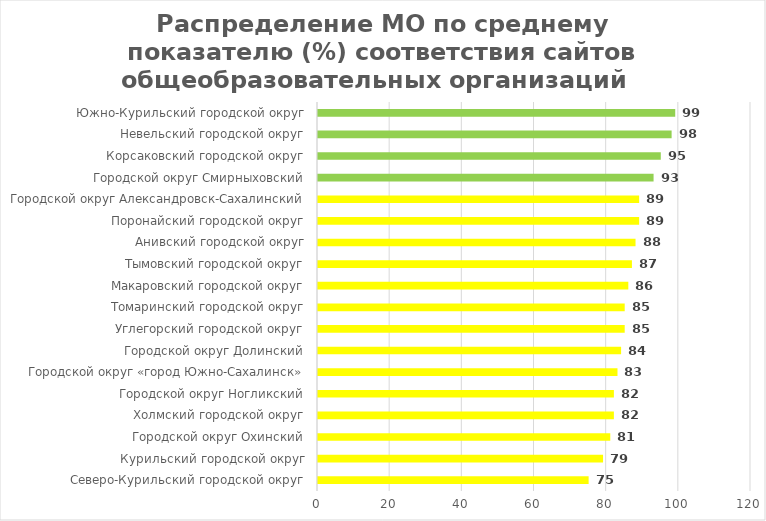
| Category | Series 0 |
|---|---|
| Северо-Курильский городской округ | 75 |
| Курильский городской округ | 79 |
| Городской округ Охинский | 81 |
| Холмский городской округ | 82 |
| Городской округ Ногликский | 82 |
| Городской округ «город Южно-Сахалинск» | 83 |
| Городской округ Долинский | 84 |
| Углегорский городской округ | 85 |
| Томаринский городской округ | 85 |
| Макаровский городской округ | 86 |
| Тымовский городской округ | 87 |
| Анивский городской округ | 88 |
| Поронайский городской округ | 89 |
| Городской округ Александровск-Сахалинский | 89 |
| Городской округ Смирныховский | 93 |
| Корсаковский городской округ | 95 |
| Невельский городской округ | 98 |
| Южно-Курильский городской округ | 99 |